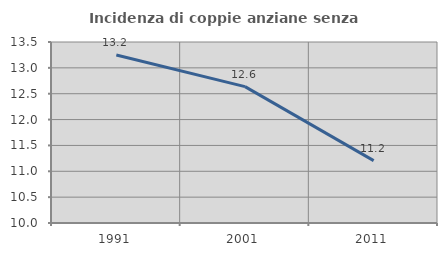
| Category | Incidenza di coppie anziane senza figli  |
|---|---|
| 1991.0 | 13.249 |
| 2001.0 | 12.637 |
| 2011.0 | 11.207 |